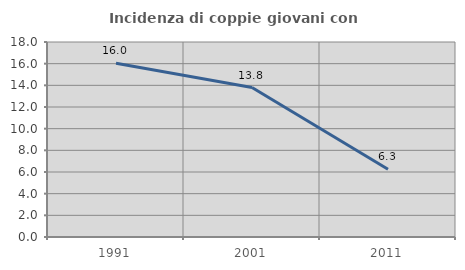
| Category | Incidenza di coppie giovani con figli |
|---|---|
| 1991.0 | 16.046 |
| 2001.0 | 13.797 |
| 2011.0 | 6.258 |